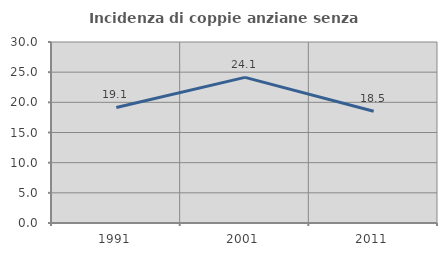
| Category | Incidenza di coppie anziane senza figli  |
|---|---|
| 1991.0 | 19.149 |
| 2001.0 | 24.138 |
| 2011.0 | 18.519 |